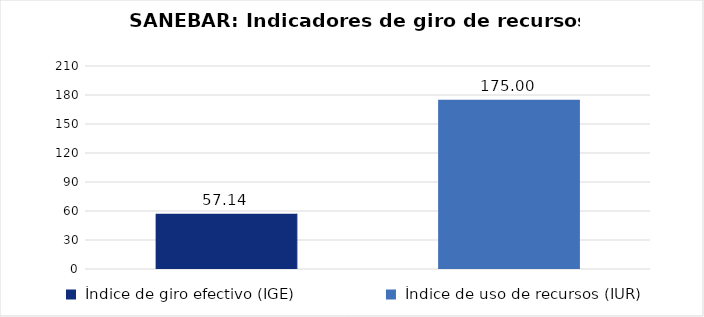
| Category | Total Programa |
|---|---|
| Índice de giro efectivo (IGE) | 57.143 |
| Índice de uso de recursos (IUR)  | 175 |